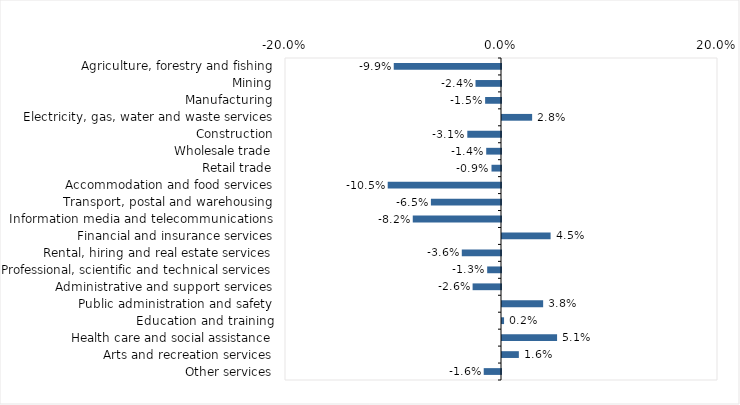
| Category | This week |
|---|---|
| Agriculture, forestry and fishing | -0.099 |
| Mining | -0.024 |
| Manufacturing | -0.015 |
| Electricity, gas, water and waste services | 0.028 |
| Construction | -0.031 |
| Wholesale trade | -0.014 |
| Retail trade | -0.009 |
| Accommodation and food services | -0.105 |
| Transport, postal and warehousing | -0.065 |
| Information media and telecommunications | -0.082 |
| Financial and insurance services | 0.045 |
| Rental, hiring and real estate services | -0.036 |
| Professional, scientific and technical services | -0.013 |
| Administrative and support services | -0.026 |
| Public administration and safety | 0.038 |
| Education and training | 0.002 |
| Health care and social assistance | 0.051 |
| Arts and recreation services | 0.016 |
| Other services | -0.016 |